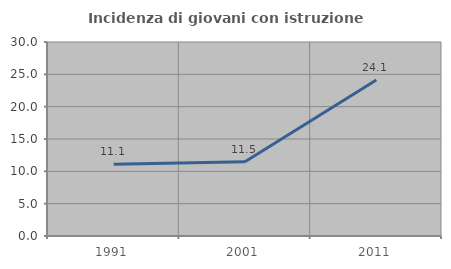
| Category | Incidenza di giovani con istruzione universitaria |
|---|---|
| 1991.0 | 11.111 |
| 2001.0 | 11.475 |
| 2011.0 | 24.138 |